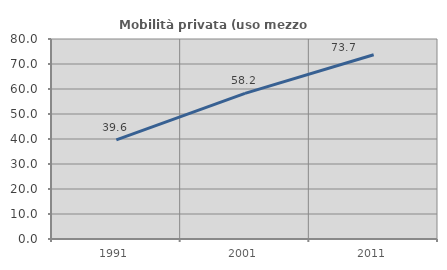
| Category | Mobilità privata (uso mezzo privato) |
|---|---|
| 1991.0 | 39.64 |
| 2001.0 | 58.228 |
| 2011.0 | 73.684 |